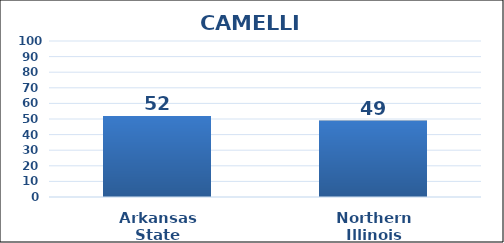
| Category | Series 0 |
|---|---|
| Arkansas State | 52 |
| Northern Illinois | 49 |